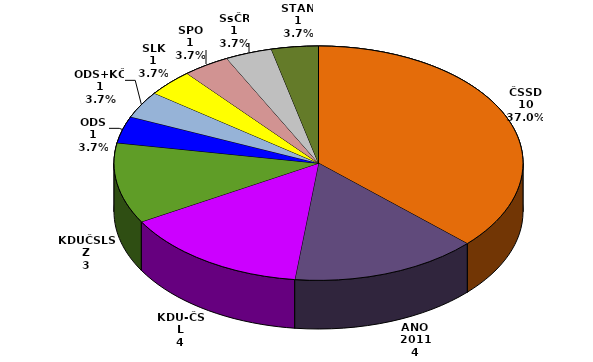
| Category | Series 0 |
|---|---|
| ČSSD | 10 |
| ANO 2011 | 4 |
| KDU-ČSL | 4 |
| KDUČSLSZ | 3 |
| ODS | 1 |
| ODS+KČ | 1 |
| SLK | 1 |
| SPO | 1 |
| SsČR | 1 |
| STAN | 1 |